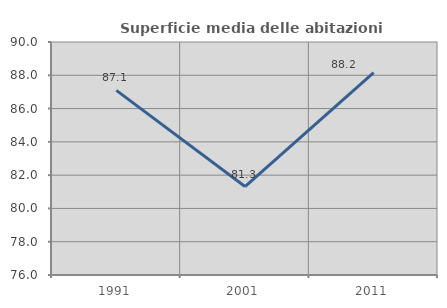
| Category | Superficie media delle abitazioni occupate |
|---|---|
| 1991.0 | 87.092 |
| 2001.0 | 81.316 |
| 2011.0 | 88.158 |